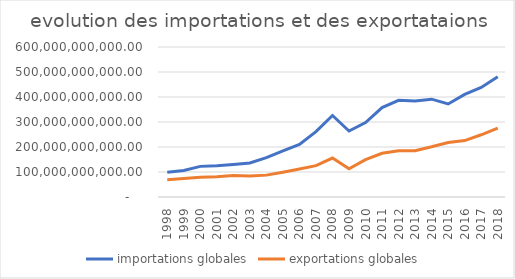
| Category | importations globales | exportations globales  |
|---|---|---|
| 1998.0 | 98675056092 | 68572308775 |
| 1999.0 | 105920747102 | 73581121663 |
| 2000.0 | 122499901090 | 78791639275 |
| 2001.0 | 124717830514 | 80522294821 |
| 2002.0 | 130198313997 | 86082815380 |
| 2003.0 | 135919643335 | 83571367383 |
| 2004.0 | 157405530717 | 87469915263 |
| 2005.0 | 184379805632 | 99265205103 |
| 2006.0 | 210553607539 | 111979259496 |
| 2007.0 | 261287516799 | 125516873036 |
| 2008.0 | 326042243203 | 155739873210 |
| 2009.0 | 263981701292 | 113020000791 |
| 2010.0 | 297963365563 | 149583350714 |
| 2011.0 | 357769591761 | 174994471311.471 |
| 2012.0 | 386948556399.567 | 184885214019.102 |
| 2013.0 | 383719891706.852 | 185386907085.036 |
| 2014.0 | 391295731413.272 | 200808045021.46 |
| 2015.0 | 372224856464.067 | 218040445572.985 |
| 2016.0 | 410583588374.116 | 225651082097.374 |
| 2017.0 | 438079671080.671 | 248840818966.86 |
| 2018.0 | 481441814690.256 | 275440533169.488 |